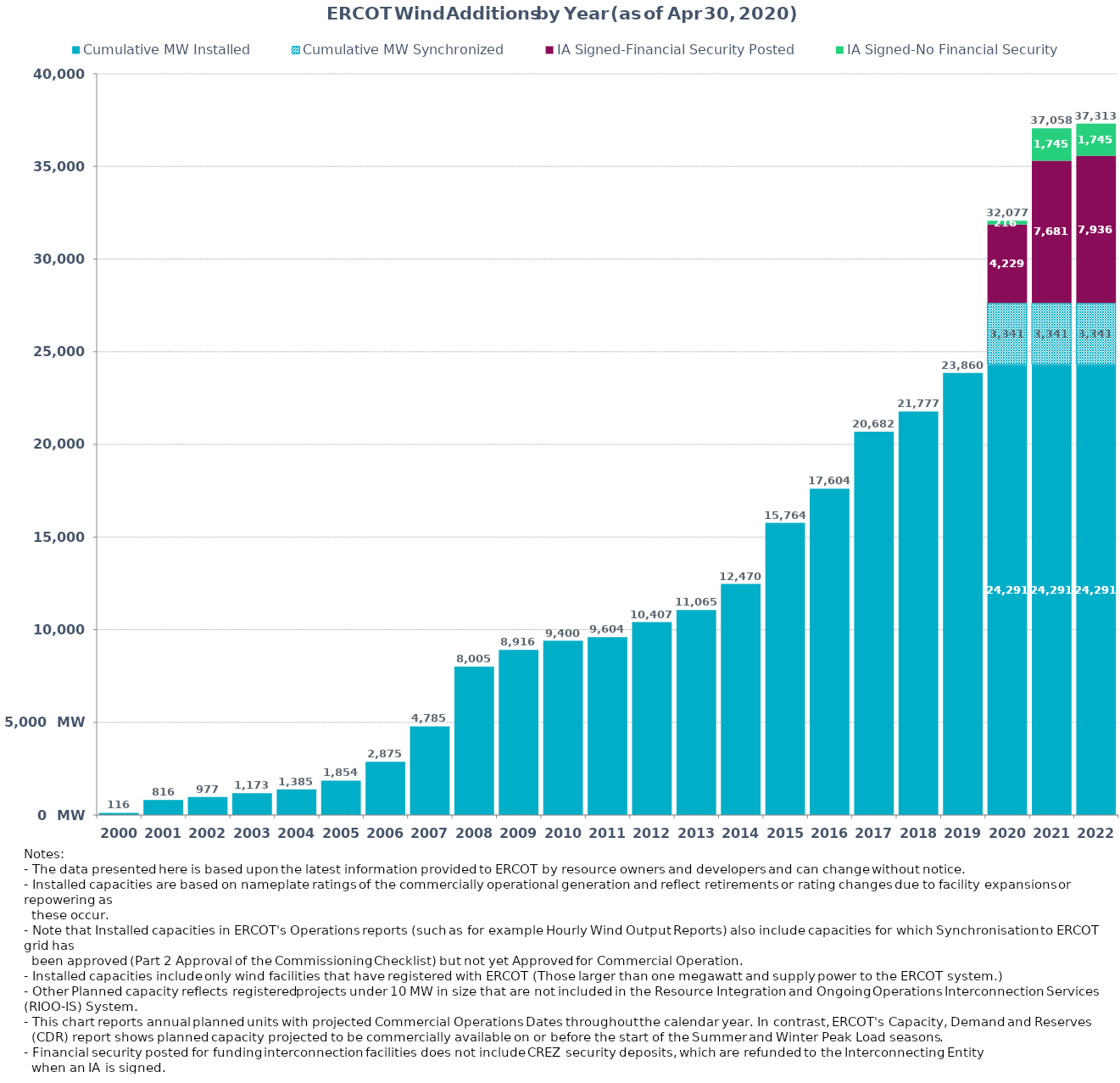
| Category | Cumulative MW Installed | Cumulative MW Synchronized | IA Signed-Financial Security Posted  | IA Signed-No Financial Security  | Other Planned | Cumulative Installed and Planned |
|---|---|---|---|---|---|---|
| 2000.0 | 116 | 0 | 0 | 0 | 0 | 116 |
| 2001.0 | 816 | 0 | 0 | 0 | 0 | 816 |
| 2002.0 | 977 | 0 | 0 | 0 | 0 | 977 |
| 2003.0 | 1173 | 0 | 0 | 0 | 0 | 1173 |
| 2004.0 | 1385 | 0 | 0 | 0 | 0 | 1385 |
| 2005.0 | 1854 | 0 | 0 | 0 | 0 | 1854 |
| 2006.0 | 2875 | 0 | 0 | 0 | 0 | 2875 |
| 2007.0 | 4785 | 0 | 0 | 0 | 0 | 4785 |
| 2008.0 | 8005 | 0 | 0 | 0 | 0 | 8005 |
| 2009.0 | 8916 | 0 | 0 | 0 | 0 | 8916 |
| 2010.0 | 9400 | 0 | 0 | 0 | 0 | 9400 |
| 2011.0 | 9604 | 0 | 0 | 0 | 0 | 9604 |
| 2012.0 | 10407 | 0 | 0 | 0 | 0 | 10407 |
| 2013.0 | 11065 | 0 | 0 | 0 | 0 | 11065 |
| 2014.0 | 12470 | 0 | 0 | 0 | 0 | 12470 |
| 2015.0 | 15764 | 0 | 0 | 0 | 0 | 15764 |
| 2016.0 | 17604 | 0 | 0 | 0 | 0 | 17604 |
| 2017.0 | 20682 | 0 | 0 | 0 | 0 | 20682 |
| 2018.0 | 21777 | 0 | 0 | 0 | 0 | 21777 |
| 2019.0 | 23860 | 0 | 0 | 0 | 0 | 23860 |
| 2020.0 | 24291.1 | 3340.91 | 4229 | 215.6 | 0 | 32076.61 |
| 2021.0 | 24291.1 | 3340.91 | 7680.98 | 1744.82 | 0 | 37057.81 |
| 2022.0 | 24291.1 | 3340.91 | 7936.28 | 1744.82 | 0 | 37313.11 |